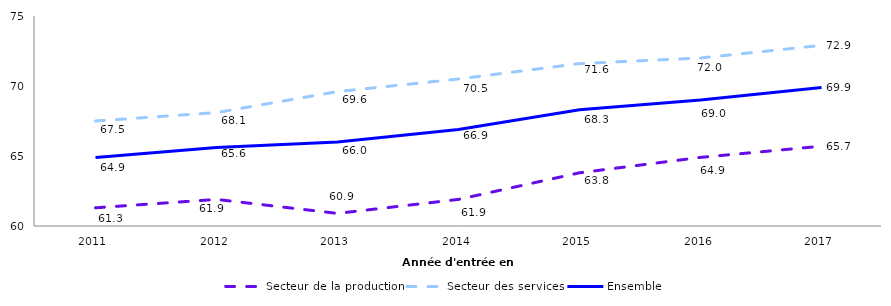
| Category | Secteur de la production | Secteur des services | Ensemble |
|---|---|---|---|
| 2011.0 | 61.3 | 67.5 | 64.9 |
| 2012.0 | 61.9 | 68.1 | 65.6 |
| 2013.0 | 60.9 | 69.6 | 66 |
| 2014.0 | 61.9 | 70.5 | 66.9 |
| 2015.0 | 63.8 | 71.6 | 68.3 |
| 2016.0 | 64.9 | 72 | 69 |
| 2017.0 | 65.7 | 72.9 | 69.9 |